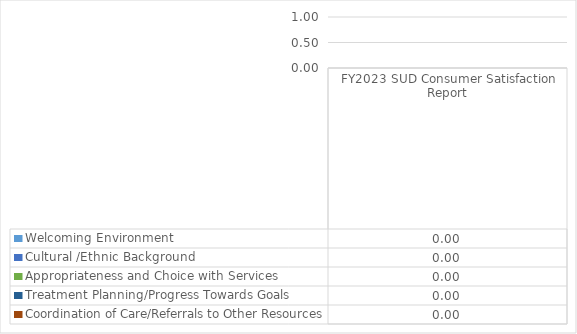
| Category | Welcoming Environment | Cultural /Ethnic Background | Appropriateness and Choice with Services | Treatment Planning/Progress Towards Goals | Coordination of Care/Referrals to Other Resources |
|---|---|---|---|---|---|
| FY2023 SUD Consumer Satisfaction Report | 0 | 0 | 0 | 0 | 0 |